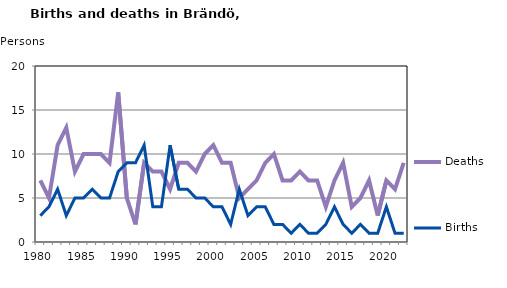
| Category | Deaths | Births |
|---|---|---|
| 1980.0 | 7 | 3 |
| 1981.0 | 5 | 4 |
| 1982.0 | 11 | 6 |
| 1983.0 | 13 | 3 |
| 1984.0 | 8 | 5 |
| 1985.0 | 10 | 5 |
| 1986.0 | 10 | 6 |
| 1987.0 | 10 | 5 |
| 1988.0 | 9 | 5 |
| 1989.0 | 17 | 8 |
| 1990.0 | 5 | 9 |
| 1991.0 | 2 | 9 |
| 1992.0 | 9 | 11 |
| 1993.0 | 8 | 4 |
| 1994.0 | 8 | 4 |
| 1995.0 | 6 | 11 |
| 1996.0 | 9 | 6 |
| 1997.0 | 9 | 6 |
| 1998.0 | 8 | 5 |
| 1999.0 | 10 | 5 |
| 2000.0 | 11 | 4 |
| 2001.0 | 9 | 4 |
| 2002.0 | 9 | 2 |
| 2003.0 | 5 | 6 |
| 2004.0 | 6 | 3 |
| 2005.0 | 7 | 4 |
| 2006.0 | 9 | 4 |
| 2007.0 | 10 | 2 |
| 2008.0 | 7 | 2 |
| 2009.0 | 7 | 1 |
| 2010.0 | 8 | 2 |
| 2011.0 | 7 | 1 |
| 2012.0 | 7 | 1 |
| 2013.0 | 4 | 2 |
| 2014.0 | 7 | 4 |
| 2015.0 | 9 | 2 |
| 2016.0 | 4 | 1 |
| 2017.0 | 5 | 2 |
| 2018.0 | 7 | 1 |
| 2019.0 | 3 | 1 |
| 2020.0 | 7 | 4 |
| 2021.0 | 6 | 1 |
| 2022.0 | 9 | 1 |